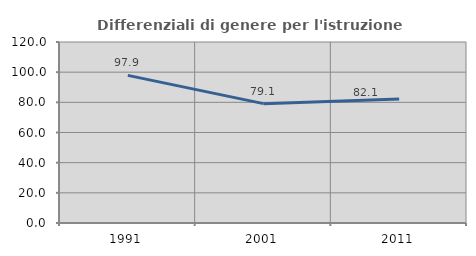
| Category | Differenziali di genere per l'istruzione superiore |
|---|---|
| 1991.0 | 97.887 |
| 2001.0 | 79.141 |
| 2011.0 | 82.149 |